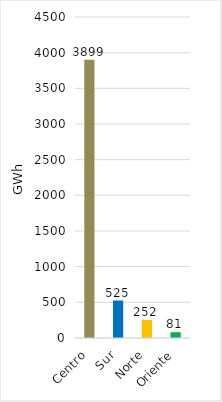
| Category | Series 0 |
|---|---|
| Centro | 3899.422 |
| Sur | 525.484 |
| Norte | 251.967 |
| Oriente | 80.893 |